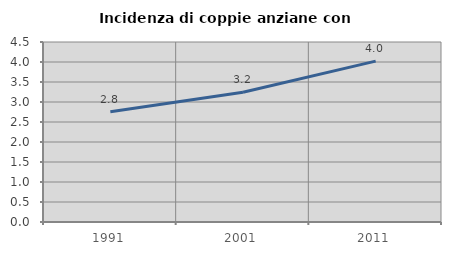
| Category | Incidenza di coppie anziane con figli |
|---|---|
| 1991.0 | 2.755 |
| 2001.0 | 3.245 |
| 2011.0 | 4.022 |